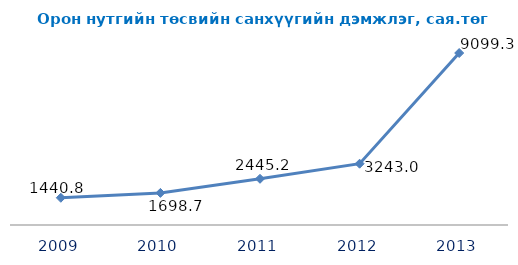
| Category | Îðîí íóòãèéí òºñâèéí ñàíõ¿¿ãèéí äýìæëýã  |
|---|---|
| 2009.0 | 1440.8 |
| 2010.0 | 1698.7 |
| 2011.0 | 2445.2 |
| 2012.0 | 3243 |
| 2013.0 | 9099.3 |